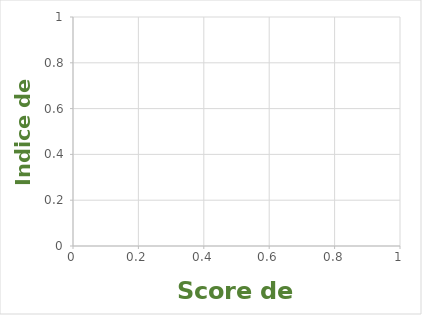
| Category | Indice de confiance |
|---|---|
| 0.0 | 0 |